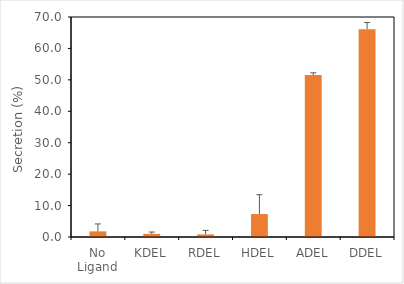
| Category | mScarlet |
|---|---|
| No Ligand | 1.796 |
| KDEL | 0.995 |
| RDEL | 0.822 |
| HDEL | 7.301 |
| ADEL | 51.552 |
| DDEL | 66.131 |